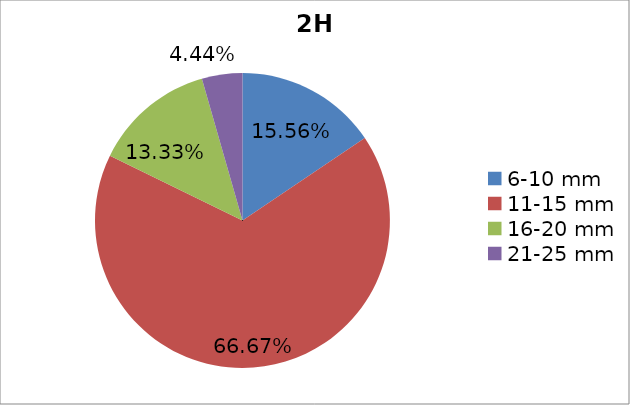
| Category | Series 0 |
|---|---|
| 6-10 mm | 0.156 |
| 11-15 mm | 0.667 |
| 16-20 mm | 0.133 |
| 21-25 mm | 0.044 |